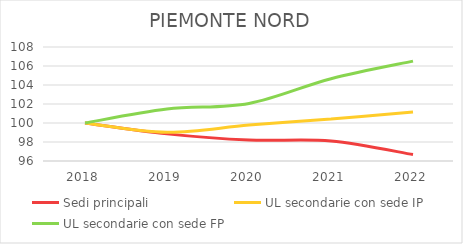
| Category | Sedi principali | UL secondarie con sede IP | UL secondarie con sede FP |
|---|---|---|---|
| 2018.0 | 100 | 100 | 100 |
| 2019.0 | 98.855 | 99.029 | 101.464 |
| 2020.0 | 98.204 | 99.777 | 102.062 |
| 2021.0 | 98.109 | 100.43 | 104.661 |
| 2022.0 | 96.675 | 101.146 | 106.513 |